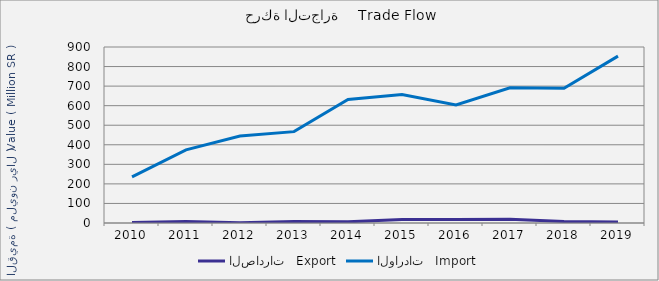
| Category | الصادرات   Export | الواردات   Import |
|---|---|---|
| 2010.0 | 2167079 | 235817156 |
| 2011.0 | 7261056 | 373730203 |
| 2012.0 | 723332 | 444751814 |
| 2013.0 | 7941100 | 467191983 |
| 2014.0 | 6194585 | 631440686 |
| 2015.0 | 17529250 | 657282392 |
| 2016.0 | 17318647 | 604051366 |
| 2017.0 | 18900317 | 691117981 |
| 2018.0 | 7935700 | 688896576 |
| 2019.0 | 4618593 | 853164391 |